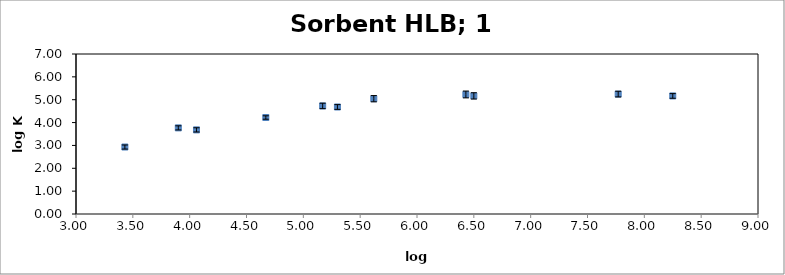
| Category | log Kow |
|---|---|
| 3.43 | 2.93 |
| 4.06 | 3.68 |
| 4.67 | 4.222 |
| 5.3 | 4.682 |
| 6.5 | 5.168 |
| 7.77 | 5.246 |
| 8.25 | 5.165 |
| 3.9 | 3.768 |
| 5.17 | 4.728 |
| 6.43 | 5.23 |
| 5.62 | 5.045 |